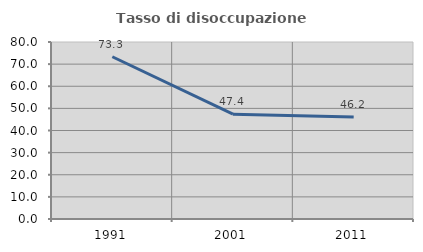
| Category | Tasso di disoccupazione giovanile  |
|---|---|
| 1991.0 | 73.333 |
| 2001.0 | 47.368 |
| 2011.0 | 46.154 |